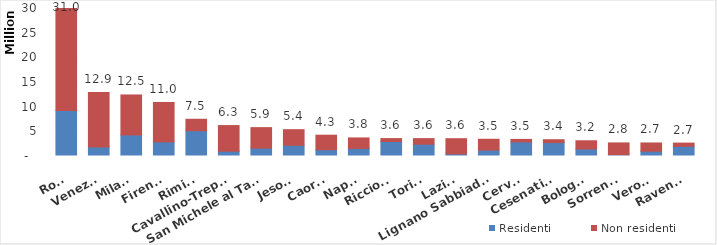
| Category | Residenti | Non residenti |
|---|---|---|
| Roma | 9323602 | 21656481 |
| Venezia | 1918634 | 11029885 |
| Milano | 4369830 | 8104378 |
| Firenze | 2964769 | 7990576 |
| Rimini | 5230640 | 2317495 |
| Cavallino-Treporti | 1078652 | 5190799 |
| San Michele al Tagliamento | 1701705 | 4149777 |
| Jesolo | 2273598 | 3164921 |
| Caorle | 1378636 | 2940847 |
| Napoli | 1632047 | 2133800 |
| Riccione | 3043078 | 588947 |
| Torino | 2493228 | 1132808 |
| Lazise | 526247 | 3080002 |
| Lignano Sabbiadoro | 1296349 | 2198742 |
| Cervia | 2952841 | 516107 |
| Cesenatico | 2824034 | 579203 |
| Bologna | 1529681 | 1658359 |
| Sorrento | 328675 | 2427903 |
| Verona | 1073326 | 1670617 |
| Ravenna | 2061873 | 657217 |